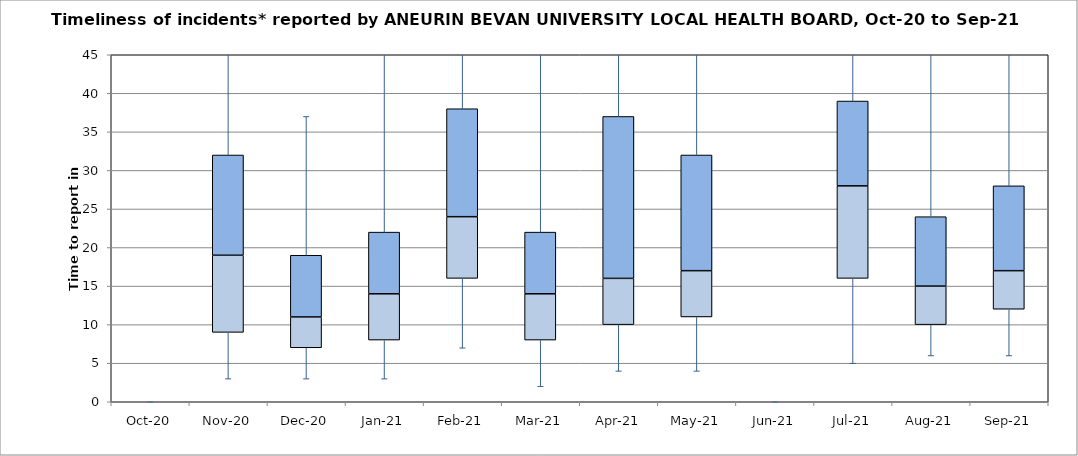
| Category | Series 0 | Series 1 | Series 2 |
|---|---|---|---|
| Oct-20 | 0 | 0 | 0 |
| Nov-20 | 9 | 10 | 13 |
| Dec-20 | 7 | 4 | 8 |
| Jan-21 | 8 | 6 | 8 |
| Feb-21 | 16 | 8 | 14 |
| Mar-21 | 8 | 6 | 8 |
| Apr-21 | 10 | 6 | 21 |
| May-21 | 11 | 6 | 15 |
| Jun-21 | 0 | 0 | 0 |
| Jul-21 | 16 | 12 | 11 |
| Aug-21 | 10 | 5 | 9 |
| Sep-21 | 12 | 5 | 11 |